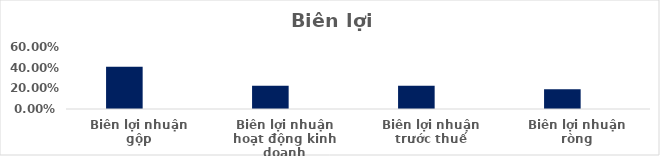
| Category | Series 0 | Series 1 | Series 2 | Series 3 | Series 4 |
|---|---|---|---|---|---|
| Biên lợi nhuận gộp | 0.409 |  |  |  |  |
| Biên lợi nhuận hoạt động kinh doanh | 0.225 |  |  |  |  |
| Biên lợi nhuận trước thuế | 0.224 |  |  |  |  |
| Biên lợi nhuận ròng | 0.191 |  |  |  |  |